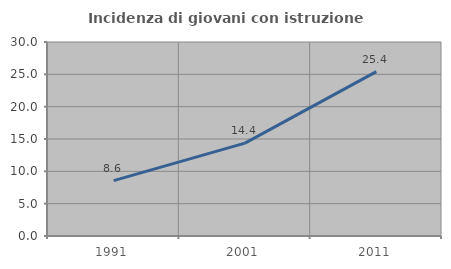
| Category | Incidenza di giovani con istruzione universitaria |
|---|---|
| 1991.0 | 8.562 |
| 2001.0 | 14.365 |
| 2011.0 | 25.413 |